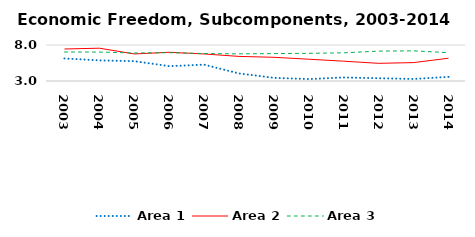
| Category | Area 1 | Area 2 | Area 3 |
|---|---|---|---|
| 2003.0 | 6.13 | 7.445 | 7.026 |
| 2004.0 | 5.867 | 7.557 | 7.018 |
| 2005.0 | 5.752 | 6.756 | 6.893 |
| 2006.0 | 5.064 | 6.992 | 6.93 |
| 2007.0 | 5.266 | 6.756 | 6.815 |
| 2008.0 | 4.047 | 6.414 | 6.771 |
| 2009.0 | 3.434 | 6.292 | 6.809 |
| 2010.0 | 3.268 | 6.025 | 6.842 |
| 2011.0 | 3.492 | 5.75 | 6.913 |
| 2012.0 | 3.383 | 5.453 | 7.152 |
| 2013.0 | 3.281 | 5.555 | 7.189 |
| 2014.0 | 3.571 | 6.165 | 6.933 |